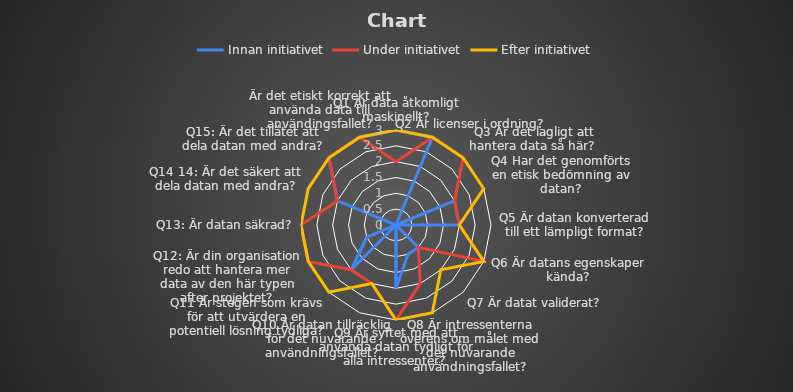
| Category | Innan initiativet | Under initiativet | Efter initiativet |
|---|---|---|---|
| Q1 Är data åtkomligt maskinellt? | 3 | 2 | 3 |
| Q2 Är licenser i ordning?  | 3 | 3 | 3 |
| Q3 Är det lagligt att hantera data så här?  | 0 | 3 | 3 |
| Q4 Har det genomförts en etisk bedömning av datan? | 2 | 2 | 3 |
| Q5 Är datan konverterad till ett lämpligt format? | 2 | 2 | 2 |
| Q6 Är datans egenskaper kända? | 0 | 3 | 3 |
| Q7 Är datat validerat?  | 1 | 1 | 2 |
| Q8 Är intressenterna överens om målet med det nuvarande användningsfallet? | 1 | 2 | 3 |
| Q9 Är syftet med att använda datan tydligt för alla intressenter? | 2 | 3 | 3 |
| Q10 Är datan tillräcklig för det nuvarande användningsfallet? | 0 | 2 | 2 |
| Q11 Är stegen som krävs för att utvärdera en potentiell lösning tydliga? | 2 | 2 | 3 |
| Q12: Är din organisation redo att hantera mer data av den här typen after projektet? | 1 | 3 | 3 |
| Q13: Är datan säkrad? | 0 | 3 | 3 |
| Q14 14: Är det säkert att dela datan med andra? | 2 | 2 | 3 |
| Q15: Är det tillåtet att dela datan med andra? | 3 | 3 | 3 |
| Är det etiskt korrekt att använda data till användingsfallet? | 3 | 3 | 3 |